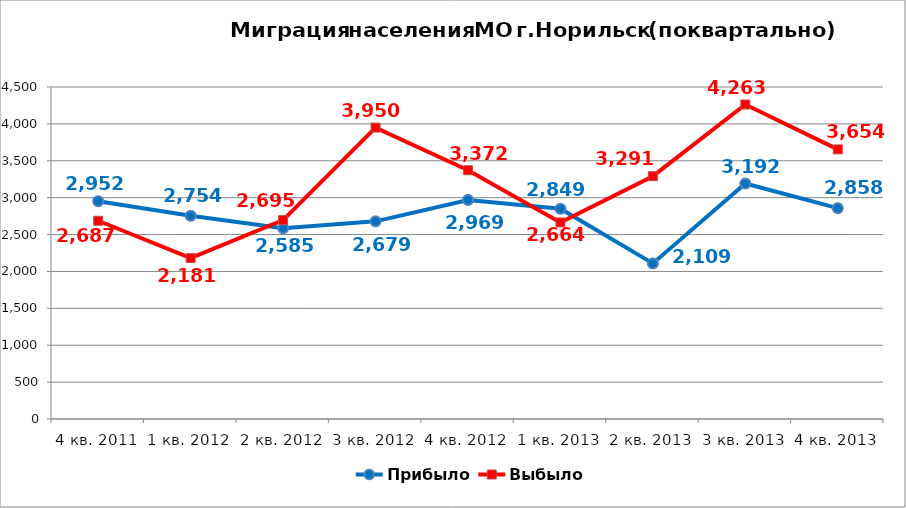
| Category | Прибыло | Выбыло |
|---|---|---|
| 4 кв. 2011 | 2952 | 2687 |
| 1 кв. 2012 | 2754 | 2181 |
| 2 кв. 2012 | 2585 | 2695 |
| 3 кв. 2012 | 2679 | 3950 |
| 4 кв. 2012 | 2969 | 3372 |
| 1 кв. 2013 | 2849 | 2664 |
| 2 кв. 2013 | 2109 | 3291 |
| 3 кв. 2013 | 3192 | 4263 |
| 4 кв. 2013 | 2858 | 3654 |